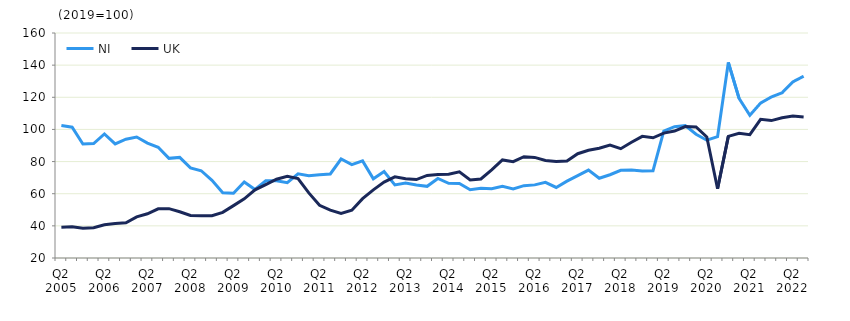
| Category | NI | UK  |
|---|---|---|
| Q2 2005 | 102.5 | 39.1 |
|  | 101.4 | 39.4 |
| Q4 2005 | 90.9 | 38.5 |
|  | 91.2 | 38.8 |
| Q2 2006 | 97.2 | 40.7 |
|  | 91 | 41.5 |
| Q4 2006 | 93.9 | 41.9 |
|  | 95.3 | 45.6 |
| Q2 2007 | 91.5 | 47.5 |
|  | 88.9 | 50.6 |
| Q4 2007 | 82 | 50.7 |
|  | 82.6 | 48.8 |
| Q2 2008 | 76.1 | 46.5 |
|  | 74.3 | 46.3 |
| Q4 2008 | 68.3 | 46.3 |
|  | 60.6 | 48.4 |
| Q2 2009 | 60.3 | 52.6 |
|  | 67.3 | 56.8 |
| Q4 2009 | 62.6 | 62.4 |
|  | 68 | 65.7 |
| Q2 2010 | 68.1 | 69 |
|  | 66.9 | 70.8 |
| Q4 2010 | 72.4 | 69.4 |
|  | 71.2 | 60.5 |
| Q2 2011 | 71.8 | 52.8 |
|  | 72.3 | 49.8 |
| Q4 2011 | 81.6 | 47.8 |
|  | 78.1 | 49.7 |
| Q2 2012 | 80.4 | 56.9 |
|  | 69.3 | 62.4 |
| Q4 2012 | 73.8 | 67.2 |
|  | 65.5 | 70.5 |
| Q2 2013 | 66.7 | 69.3 |
|  | 65.4 | 68.8 |
| Q4 2013 | 64.6 | 71.4 |
|  | 69.5 | 72 |
| Q2 2014 | 66.5 | 72.1 |
|  | 66.4 | 73.6 |
| Q4 2014 | 62.5 | 68.6 |
|  | 63.4 | 69.2 |
| Q2 2015 | 63.1 | 74.9 |
|  | 64.6 | 81 |
| Q4 2015 | 62.9 | 79.9 |
|  | 65 | 83 |
| Q2 2016 | 65.5 | 82.6 |
|  | 67.1 | 80.7 |
| Q4 2016 | 63.9 | 80.1 |
|  | 67.8 | 80.3 |
| Q2 2017 | 71.3 | 84.9 |
|  | 74.7 | 87 |
| Q4 2017 | 69.6 | 88.3 |
|  | 71.8 | 90.2 |
| Q2 2018 | 74.6 | 88 |
|  | 74.7 | 92 |
| Q4 2018 | 74.2 | 95.7 |
|  | 74.3 | 94.8 |
| Q2 2019 | 98.9 | 97.7 |
|  | 101.7 | 99 |
| Q4 2019 | 102.4 | 101.8 |
|  | 97 | 101.5 |
| Q2 2020 | 93.3 | 95.3 |
|  | 95.5 | 63.1 |
| Q4 2020 | 141.7 | 95.7 |
|  | 119.3 | 97.6 |
| Q2 2021 | 108.8 | 96.7 |
|  | 116.4 | 106.3 |
| Q4 2021 | 120.2 | 105.5 |
|  | 122.8 | 107.3 |
| Q2 2022 | 129.6 | 108.3 |